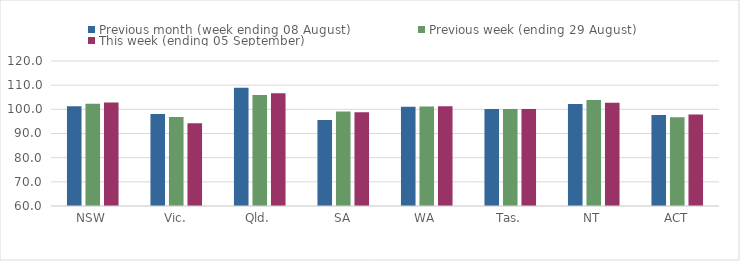
| Category | Previous month (week ending 08 August) | Previous week (ending 29 August) | This week (ending 05 September) |
|---|---|---|---|
| NSW | 101.25 | 102.26 | 102.81 |
| Vic. | 98.02 | 96.82 | 94.25 |
| Qld. | 108.88 | 105.98 | 106.64 |
| SA | 95.59 | 99.1 | 98.8 |
| WA | 101.03 | 101.19 | 101.23 |
| Tas. | 100.15 | 100.15 | 100.15 |
| NT | 102.16 | 103.91 | 102.77 |
| ACT | 97.61 | 96.71 | 97.83 |